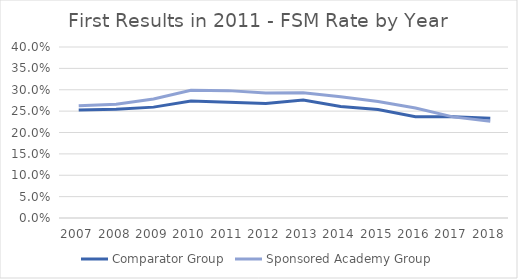
| Category | Comparator Group | Sponsored Academy Group |
|---|---|---|
| 2007.0 | 0.253 | 0.263 |
| 2008.0 | 0.254 | 0.266 |
| 2009.0 | 0.259 | 0.278 |
| 2010.0 | 0.273 | 0.299 |
| 2011.0 | 0.271 | 0.298 |
| 2012.0 | 0.268 | 0.292 |
| 2013.0 | 0.276 | 0.293 |
| 2014.0 | 0.261 | 0.284 |
| 2015.0 | 0.254 | 0.273 |
| 2016.0 | 0.237 | 0.257 |
| 2017.0 | 0.237 | 0.237 |
| 2018.0 | 0.233 | 0.227 |